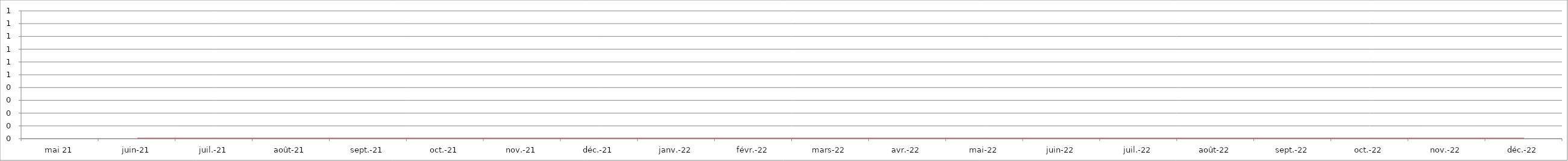
| Category | Trésorerie |
|---|---|
| mai 21 | 0 |
| juin-21 | 0 |
| juil.-21 | 0 |
| août-21 | 0 |
| sept.-21 | 0 |
| oct.-21 | 0 |
| nov.-21 | 0 |
| déc.-21 | 0 |
| janv.-22 | 0 |
| févr.-22 | 0 |
| mars-22 | 0 |
| avr.-22 | 0 |
| mai-22 | 0 |
| juin-22 | 0 |
| juil.-22 | 0 |
| août-22 | 0 |
| sept.-22 | 0 |
| oct.-22 | 0 |
| nov.-22 | 0 |
| déc.-22 | 0 |